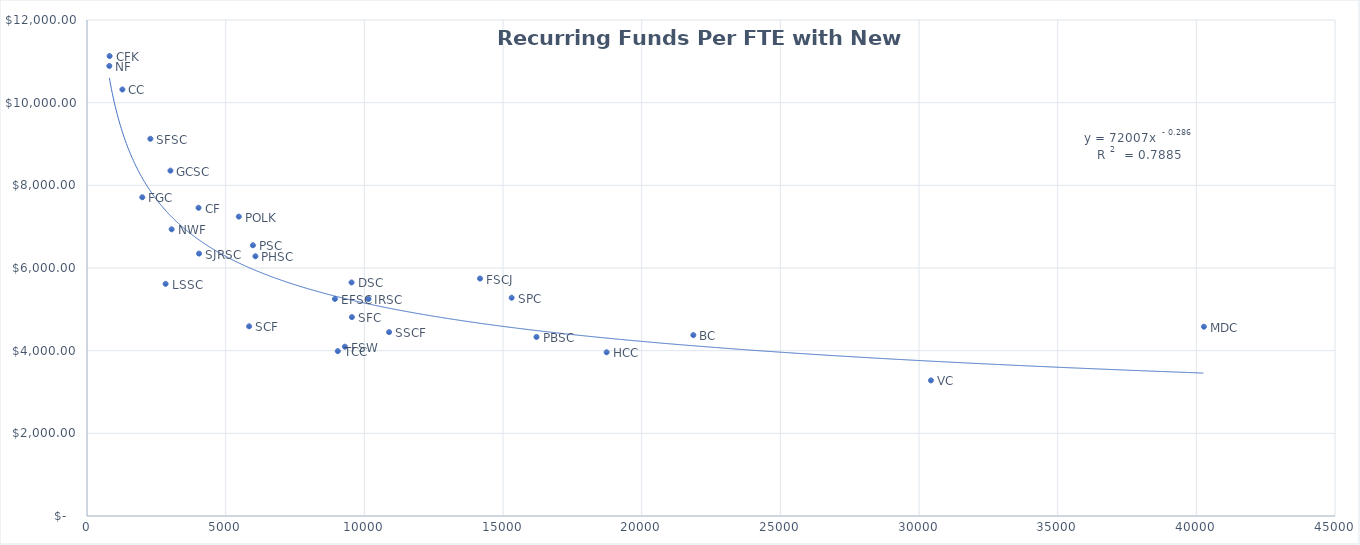
| Category | Total Funds Per FTE & New $  |
|---|---|
| 804.9 | 10888.286 |
| 815.1 | 11127.396 |
| 1276.4 | 10319.024 |
| 1993.2 | 7711.342 |
| 2284.9 | 9126.566 |
| 2834.2 | 5616.999 |
| 3009.0 | 8355.665 |
| 3051.9 | 6936.359 |
| 4021.1 | 7457.616 |
| 4040.3 | 6348.249 |
| 5473.6 | 7243.684 |
| 5844.3 | 4589.334 |
| 5983.3 | 6550.124 |
| 6073.3 | 6283.957 |
| 8940.3 | 5252.202 |
| 9043.7 | 3989.266 |
| 9298.5 | 4096.106 |
| 9538.7 | 5650.629 |
| 9551.9 | 4812.697 |
| 10150.0 | 5251.332 |
| 10892.9 | 4448.6 |
| 14172.4 | 5745.725 |
| 15311.3 | 5280.848 |
| 16208.1 | 4332.18 |
| 18736.5 | 3961.227 |
| 21862.8 | 4376.876 |
| 30430.4 | 3281.367 |
| 40272.8 | 4580.213 |